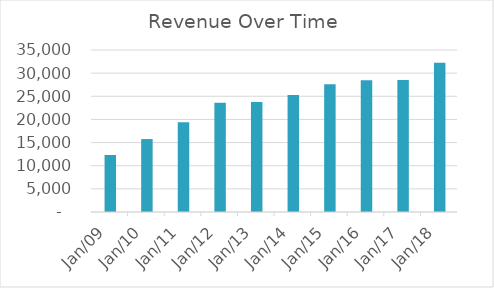
| Category | Revenue |
|---|---|
| Mar-09 | 12319.12 |
| Mar-10 | 15758.18 |
| Mar-11 | 19397.93 |
| Mar-12 | 23579.03 |
| Mar-13 | 23768.11 |
| Mar-14 | 25275.47 |
| Mar-15 | 27585.3 |
| Mar-16 | 28442.7 |
| Mar-17 | 28500.46 |
| Mar-18 | 32230.49 |